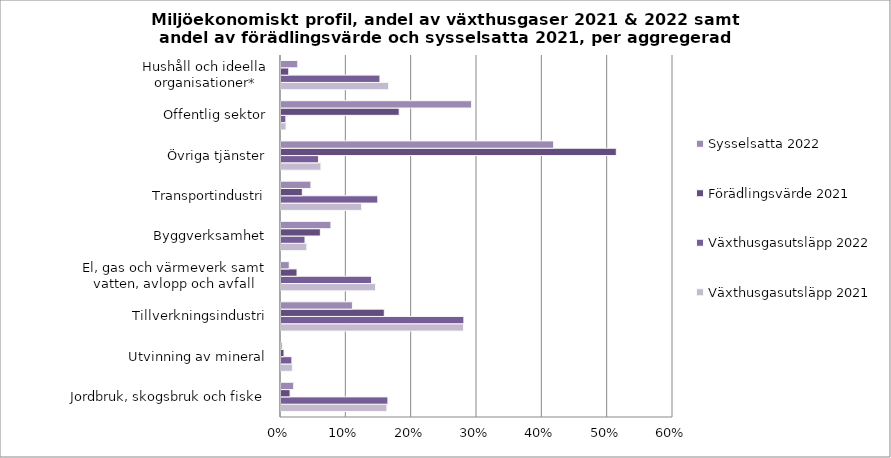
| Category | Växthusgasutsläpp 2021 | Växthusgasutsläpp 2022 | Förädlingsvärde 2021 | Sysselsatta 2022 |
|---|---|---|---|---|
| Jordbruk, skogsbruk och fiske | 0.162 | 0.164 | 0.014 | 0.019 |
| Utvinning av mineral | 0.017 | 0.017 | 0.005 | 0.002 |
| Tillverkningsindustri | 0.279 | 0.28 | 0.158 | 0.109 |
| El, gas och värmeverk samt vatten, avlopp och avfall | 0.145 | 0.139 | 0.025 | 0.013 |
| Byggverksamhet | 0.04 | 0.037 | 0.06 | 0.076 |
| Transportindustri | 0.123 | 0.148 | 0.033 | 0.046 |
| Övriga tjänster | 0.061 | 0.057 | 0.513 | 0.417 |
| Offentlig sektor | 0.008 | 0.007 | 0.181 | 0.292 |
| Hushåll och ideella organisationer* | 0.165 | 0.151 | 0.012 | 0.026 |